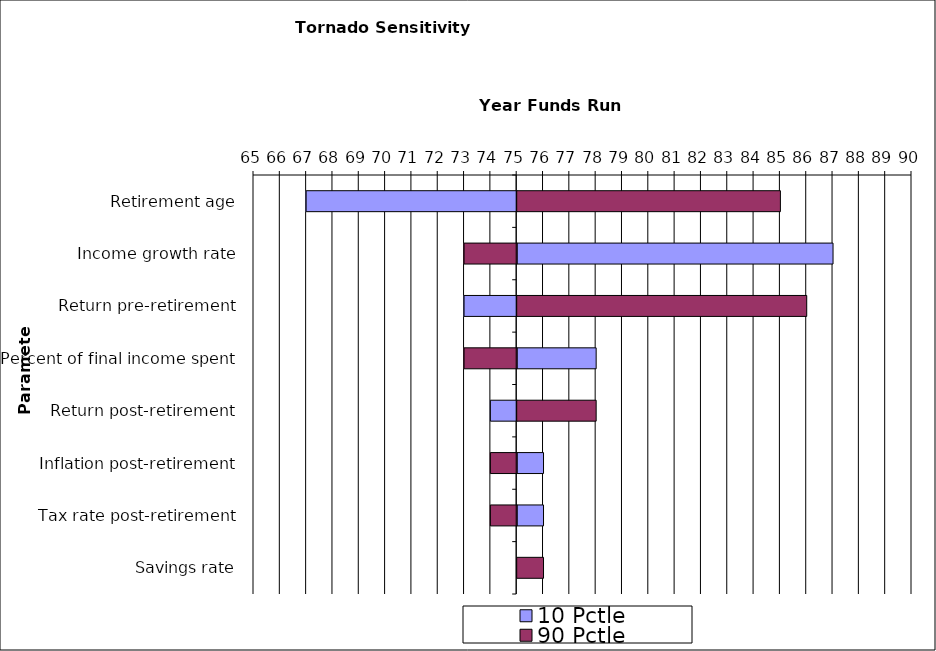
| Category | 10 Pctle | 90 Pctle |
|---|---|---|
| Retirement age | 67 | 85 |
| Income growth rate | 87 | 73 |
| Return pre-retirement | 73 | 86 |
| Percent of final income spent | 78 | 73 |
| Return post-retirement | 74 | 78 |
| Inflation post-retirement | 76 | 74 |
| Tax rate post-retirement | 76 | 74 |
| Savings rate | 75 | 76 |